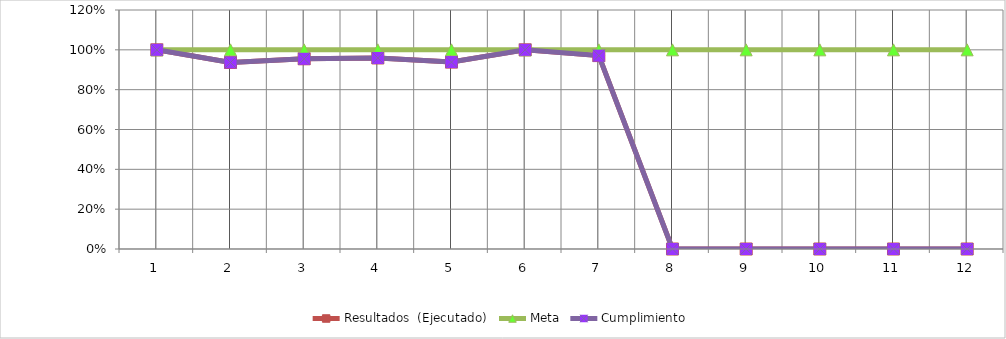
| Category | Resultados  (Ejecutado) | Meta | Cumplimiento |
|---|---|---|---|
| 0 | 1 | 1 | 1 |
| 1 | 0.937 | 1 | 0.937 |
| 2 | 0.955 | 1 | 0.955 |
| 3 | 0.959 | 1 | 0.959 |
| 4 | 0.938 | 1 | 0.938 |
| 5 | 1 | 1 | 1 |
| 6 | 0.971 | 1 | 0.971 |
| 7 | 0 | 1 | 0 |
| 8 | 0 | 1 | 0 |
| 9 | 0 | 1 | 0 |
| 10 | 0 | 1 | 0 |
| 11 | 0 | 1 | 0 |